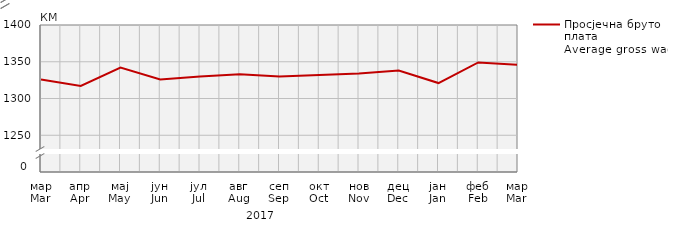
| Category | Просјечна бруто плата
Average gross wage |
|---|---|
| мар
Mar | 1326 |
| апр
Apr | 1317 |
| мај
May | 1342 |
| јун
Jun | 1326 |
| јул
Jul | 1330 |
| авг
Aug | 1333 |
| сеп
Sep | 1330 |
| окт
Oct | 1332 |
| нов
Nov | 1334 |
| дец
Dec | 1338 |
| јан
Jan | 1321 |
| феб
Feb | 1349 |
| мар
Mar | 1346 |